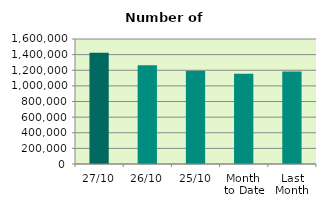
| Category | Series 0 |
|---|---|
| 27/10 | 1424790 |
| 26/10 | 1263458 |
| 25/10 | 1193072 |
| Month 
to Date | 1156402 |
| Last
Month | 1182612.273 |